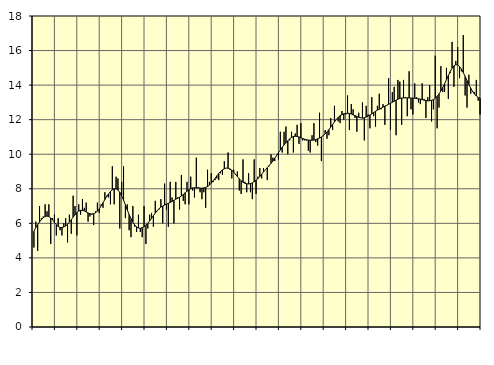
| Category | Piggar | Series 1 |
|---|---|---|
| nan | 4.6 | 5.54 |
| 1.0 | 6.1 | 5.76 |
| 1.0 | 4.4 | 5.92 |
| 1.0 | 7 | 6.08 |
| 1.0 | 6.3 | 6.22 |
| 1.0 | 6.4 | 6.33 |
| 1.0 | 7.1 | 6.4 |
| 1.0 | 6.7 | 6.42 |
| 1.0 | 7.1 | 6.39 |
| 1.0 | 4.8 | 6.31 |
| 1.0 | 6.3 | 6.2 |
| 1.0 | 6.5 | 6.05 |
| nan | 5.3 | 5.92 |
| 2.0 | 6.3 | 5.82 |
| 2.0 | 5.6 | 5.76 |
| 2.0 | 5.3 | 5.76 |
| 2.0 | 6 | 5.79 |
| 2.0 | 6.3 | 5.85 |
| 2.0 | 4.9 | 5.95 |
| 2.0 | 6.5 | 6.07 |
| 2.0 | 5.4 | 6.21 |
| 2.0 | 7.6 | 6.36 |
| 2.0 | 7 | 6.5 |
| 2.0 | 5.3 | 6.62 |
| nan | 7.1 | 6.71 |
| 3.0 | 6.5 | 6.75 |
| 3.0 | 7.4 | 6.75 |
| 3.0 | 6.9 | 6.72 |
| 3.0 | 7.2 | 6.66 |
| 3.0 | 6.1 | 6.6 |
| 3.0 | 6.4 | 6.56 |
| 3.0 | 6.5 | 6.54 |
| 3.0 | 5.9 | 6.56 |
| 3.0 | 6.7 | 6.61 |
| 3.0 | 7.2 | 6.7 |
| 3.0 | 6.6 | 6.83 |
| nan | 7.1 | 7.01 |
| 4.0 | 6.9 | 7.19 |
| 4.0 | 7.8 | 7.38 |
| 4.0 | 7.6 | 7.55 |
| 4.0 | 7.5 | 7.7 |
| 4.0 | 7.1 | 7.84 |
| 4.0 | 9.3 | 7.94 |
| 4.0 | 7.1 | 8 |
| 4.0 | 8.7 | 8 |
| 4.0 | 8.6 | 7.93 |
| 4.0 | 5.7 | 7.79 |
| 4.0 | 8.4 | 7.59 |
| nan | 9.3 | 7.34 |
| 5.0 | 6.3 | 7.07 |
| 5.0 | 7.1 | 6.78 |
| 5.0 | 5.6 | 6.51 |
| 5.0 | 5.2 | 6.27 |
| 5.0 | 7 | 6.06 |
| 5.0 | 5.8 | 5.9 |
| 5.0 | 5.5 | 5.79 |
| 5.0 | 6.5 | 5.73 |
| 5.0 | 5.5 | 5.71 |
| 5.0 | 5.2 | 5.75 |
| 5.0 | 7 | 5.81 |
| nan | 4.8 | 5.9 |
| 6.0 | 5.7 | 6.01 |
| 6.0 | 6.5 | 6.14 |
| 6.0 | 6.6 | 6.28 |
| 6.0 | 5.8 | 6.44 |
| 6.0 | 7.3 | 6.6 |
| 6.0 | 6.7 | 6.73 |
| 6.0 | 6.8 | 6.85 |
| 6.0 | 7.4 | 6.94 |
| 6.0 | 6 | 7 |
| 6.0 | 8.3 | 7.06 |
| 6.0 | 6.8 | 7.11 |
| nan | 5.8 | 7.16 |
| 7.0 | 8.4 | 7.21 |
| 7.0 | 7.5 | 7.27 |
| 7.0 | 6 | 7.33 |
| 7.0 | 8.4 | 7.4 |
| 7.0 | 7.5 | 7.45 |
| 7.0 | 6.8 | 7.51 |
| 7.0 | 8.8 | 7.59 |
| 7.0 | 7.3 | 7.67 |
| 7.0 | 7.1 | 7.77 |
| 7.0 | 8.4 | 7.86 |
| 7.0 | 7.1 | 7.94 |
| nan | 8.7 | 8.01 |
| 8.0 | 7.9 | 8.05 |
| 8.0 | 7.5 | 8.06 |
| 8.0 | 9.8 | 8.05 |
| 8.0 | 8.1 | 8.05 |
| 8.0 | 7.8 | 8.04 |
| 8.0 | 7.4 | 8.03 |
| 8.0 | 7.8 | 8.05 |
| 8.0 | 6.9 | 8.08 |
| 8.0 | 9.1 | 8.13 |
| 8.0 | 8.4 | 8.21 |
| 8.0 | 8.9 | 8.32 |
| nan | 8.4 | 8.46 |
| 9.0 | 8.5 | 8.6 |
| 9.0 | 8.6 | 8.75 |
| 9.0 | 8.5 | 8.88 |
| 9.0 | 8.9 | 9 |
| 9.0 | 8.8 | 9.09 |
| 9.0 | 9.6 | 9.16 |
| 9.0 | 9.2 | 9.2 |
| 9.0 | 10.1 | 9.19 |
| 9.0 | 9.1 | 9.15 |
| 9.0 | 8.6 | 9.08 |
| 9.0 | 9.1 | 8.97 |
| nan | 8.8 | 8.84 |
| 10.0 | 9 | 8.71 |
| 10.0 | 7.9 | 8.58 |
| 10.0 | 7.7 | 8.47 |
| 10.0 | 9.7 | 8.38 |
| 10.0 | 8.4 | 8.32 |
| 10.0 | 7.8 | 8.29 |
| 10.0 | 8.9 | 8.28 |
| 10.0 | 7.8 | 8.3 |
| 10.0 | 7.4 | 8.34 |
| 10.0 | 9.7 | 8.41 |
| 10.0 | 7.7 | 8.49 |
| nan | 8.7 | 8.59 |
| 11.0 | 9.2 | 8.71 |
| 11.0 | 8.6 | 8.84 |
| 11.0 | 9.2 | 8.98 |
| 11.0 | 9.1 | 9.1 |
| 11.0 | 8.5 | 9.22 |
| 11.0 | 9.3 | 9.34 |
| 11.0 | 10 | 9.47 |
| 11.0 | 9.8 | 9.61 |
| 11.0 | 9.6 | 9.77 |
| 11.0 | 9.9 | 9.93 |
| 11.0 | 9.7 | 10.09 |
| nan | 11.3 | 10.25 |
| 12.0 | 10.1 | 10.4 |
| 12.0 | 11.3 | 10.54 |
| 12.0 | 11.6 | 10.66 |
| 12.0 | 10 | 10.78 |
| 12.0 | 10.8 | 10.89 |
| 12.0 | 11.3 | 10.97 |
| 12.0 | 10.1 | 11.03 |
| 12.0 | 11.2 | 11.04 |
| 12.0 | 11.7 | 11.03 |
| 12.0 | 10.6 | 11 |
| 12.0 | 11.8 | 10.95 |
| nan | 10.8 | 10.91 |
| 13.0 | 10.8 | 10.87 |
| 13.0 | 10.8 | 10.84 |
| 13.0 | 10.2 | 10.82 |
| 13.0 | 10.1 | 10.81 |
| 13.0 | 11.1 | 10.81 |
| 13.0 | 11.8 | 10.82 |
| 13.0 | 10.7 | 10.85 |
| 13.0 | 10.5 | 10.89 |
| 13.0 | 12.4 | 10.94 |
| 13.0 | 9.6 | 11 |
| 13.0 | 11.1 | 11.08 |
| nan | 11.4 | 11.18 |
| 14.0 | 10.9 | 11.29 |
| 14.0 | 11.1 | 11.42 |
| 14.0 | 12.1 | 11.57 |
| 14.0 | 11.4 | 11.72 |
| 14.0 | 12.8 | 11.87 |
| 14.0 | 12 | 12.01 |
| 14.0 | 11.9 | 12.13 |
| 14.0 | 11.8 | 12.23 |
| 14.0 | 12.5 | 12.29 |
| 14.0 | 12 | 12.34 |
| 14.0 | 12.3 | 12.36 |
| nan | 13.4 | 12.37 |
| 15.0 | 11.4 | 12.36 |
| 15.0 | 12.9 | 12.33 |
| 15.0 | 12.6 | 12.28 |
| 15.0 | 12.1 | 12.23 |
| 15.0 | 11.3 | 12.19 |
| 15.0 | 12.4 | 12.14 |
| 15.0 | 12.1 | 12.11 |
| 15.0 | 13 | 12.09 |
| 15.0 | 10.8 | 12.11 |
| 15.0 | 12.8 | 12.15 |
| 15.0 | 12.3 | 12.21 |
| nan | 11.5 | 12.27 |
| 16.0 | 13.3 | 12.34 |
| 16.0 | 12.2 | 12.41 |
| 16.0 | 11.6 | 12.48 |
| 16.0 | 12.8 | 12.55 |
| 16.0 | 13.5 | 12.61 |
| 16.0 | 12.6 | 12.67 |
| 16.0 | 12.9 | 12.73 |
| 16.0 | 11.7 | 12.78 |
| 16.0 | 12.8 | 12.83 |
| 16.0 | 14.4 | 12.89 |
| 16.0 | 11.4 | 12.94 |
| nan | 13.6 | 13.01 |
| 17.0 | 13.9 | 13.07 |
| 17.0 | 11.1 | 13.13 |
| 17.0 | 14.3 | 13.18 |
| 17.0 | 14.2 | 13.23 |
| 17.0 | 11.7 | 13.25 |
| 17.0 | 14.3 | 13.26 |
| 17.0 | 13.3 | 13.26 |
| 17.0 | 12.2 | 13.26 |
| 17.0 | 14.8 | 13.26 |
| 17.0 | 12.6 | 13.25 |
| 17.0 | 12.3 | 13.25 |
| nan | 14.1 | 13.24 |
| 18.0 | 13.3 | 13.22 |
| 18.0 | 13 | 13.21 |
| 18.0 | 12.9 | 13.19 |
| 18.0 | 14.1 | 13.16 |
| 18.0 | 13.2 | 13.13 |
| 18.0 | 12.1 | 13.11 |
| 18.0 | 13.3 | 13.09 |
| 18.0 | 14 | 13.09 |
| 18.0 | 11.9 | 13.12 |
| 18.0 | 12.6 | 13.16 |
| 18.0 | 15.7 | 13.24 |
| nan | 11.5 | 13.35 |
| 19.0 | 12.7 | 13.49 |
| 19.0 | 15.1 | 13.67 |
| 19.0 | 13.6 | 13.86 |
| 19.0 | 13.6 | 14.08 |
| 19.0 | 15 | 14.31 |
| 19.0 | 13.2 | 14.55 |
| 19.0 | 14.7 | 14.78 |
| 19.0 | 16.5 | 14.98 |
| 19.0 | 13.9 | 15.12 |
| 19.0 | 15.4 | 15.18 |
| 19.0 | 16.2 | 15.17 |
| nan | 14.4 | 15.07 |
| 20.0 | 14.8 | 14.93 |
| 20.0 | 16.9 | 14.73 |
| 20.0 | 13.4 | 14.5 |
| 20.0 | 12.7 | 14.26 |
| 20.0 | 14.6 | 14.03 |
| 20.0 | 13.5 | 13.82 |
| 20.0 | 13.6 | 13.64 |
| 20.0 | 13.6 | 13.49 |
| 20.0 | 14.3 | 13.37 |
| 20.0 | 13.1 | 13.29 |
| 20.0 | 12.3 | 13.24 |